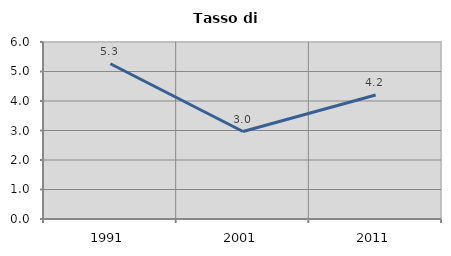
| Category | Tasso di disoccupazione   |
|---|---|
| 1991.0 | 5.263 |
| 2001.0 | 2.966 |
| 2011.0 | 4.202 |